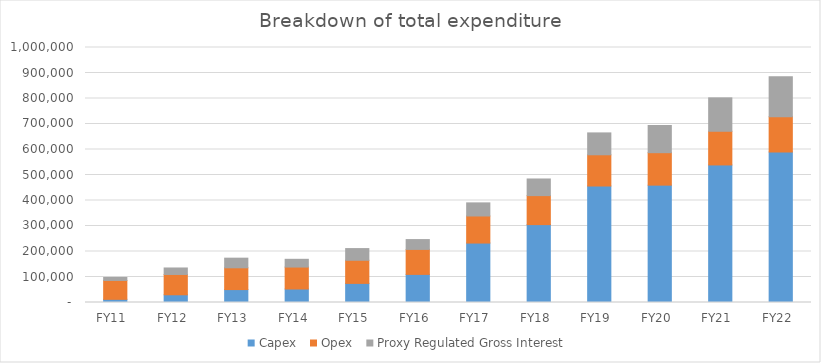
| Category | Capex | Opex | Proxy Regulated Gross Interest |
|---|---|---|---|
| FY11  | 12370.179 | 74094.827 | 11734.802 |
| FY12  | 30252.047 | 79667.711 | 25473.971 |
| FY13  | 50702.941 | 85364.518 | 37802.703 |
| FY14  | 52947.042 | 86064.755 | 30404.675 |
| FY15  | 74910.171 | 90621.353 | 45930.695 |
| FY16  | 110204.754 | 97981.448 | 38562.601 |
| FY17  | 233111.958 | 106161.435 | 51387.904 |
| FY18  | 305455.198 | 113722.415 | 65194.479 |
| FY19  | 456796.654 | 122465.183 | 85841.688 |
| FY20  | 460241.937 | 127281.029 | 106644.624 |
| FY21  | 539451.71 | 132044.871 | 131027.841 |
| FY22  | 590651.611 | 137398.283 | 157725.294 |